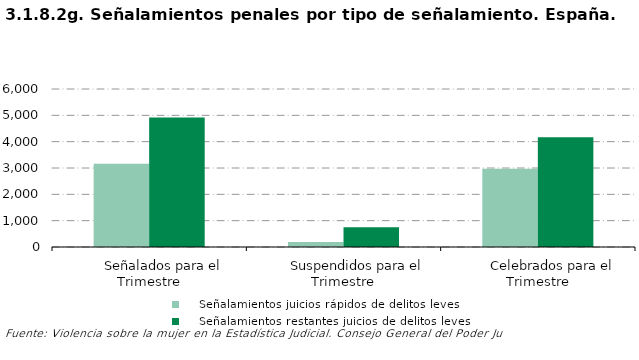
| Category |     Señalamientos juicios rápidos de delitos leves |     Señalamientos restantes juicios de delitos leves |
|---|---|---|
|         Señalados para el Trimestre | 3161 | 4915 |
|         Suspendidos para el Trimestre | 187 | 749 |
|         Celebrados para el Trimestre | 2974 | 4166 |